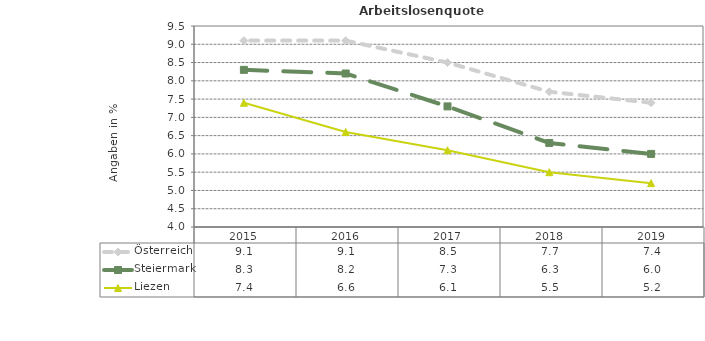
| Category | Österreich | Steiermark | Liezen |
|---|---|---|---|
| 2019.0 | 7.4 | 6 | 5.2 |
| 2018.0 | 7.7 | 6.3 | 5.5 |
| 2017.0 | 8.5 | 7.3 | 6.1 |
| 2016.0 | 9.1 | 8.2 | 6.6 |
| 2015.0 | 9.1 | 8.3 | 7.4 |